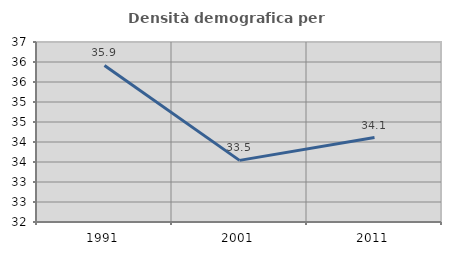
| Category | Densità demografica |
|---|---|
| 1991.0 | 35.915 |
| 2001.0 | 33.54 |
| 2011.0 | 34.111 |